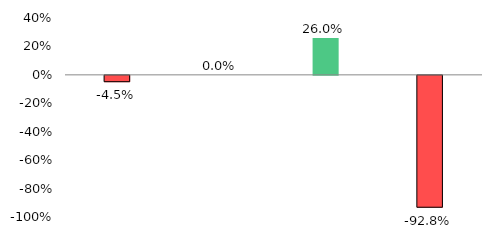
| Category | Series 1 |
|---|---|
| Advances | -0.045 |
| Performing Advances | 0 |
| Classified Advances | 0.26 |
| Non Fund Base Advances | -0.928 |